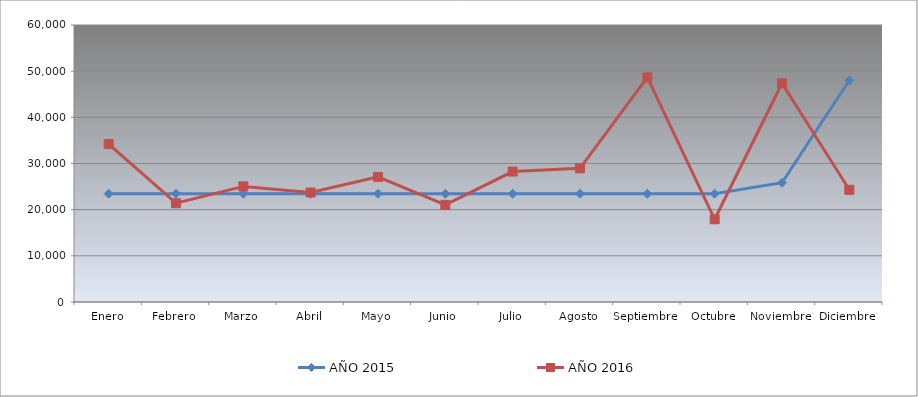
| Category | AÑO 2015 | AÑO 2016 |
|---|---|---|
| Enero | 23452.901 | 34220 |
| Febrero | 23452.901 | 21400 |
| Marzo | 23452.901 | 25040 |
| Abril | 23452.901 | 23720 |
| Mayo | 23452.901 | 27100 |
| Junio | 23452.901 | 21040 |
| Julio | 23452.901 | 28260 |
| Agosto | 23452.901 | 28960 |
| Septiembre | 23452.901 | 48660 |
| Octubre | 23452.901 | 17920 |
| Noviembre | 25832.901 | 47380 |
| Diciembre | 48032.901 | 24300 |